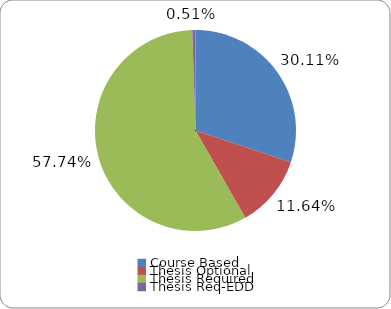
| Category | Total |
|---|---|
| Course Based | 0.301 |
| Thesis Optional | 0.116 |
| Thesis Required | 0.577 |
| Thesis Req-EDD | 0.005 |